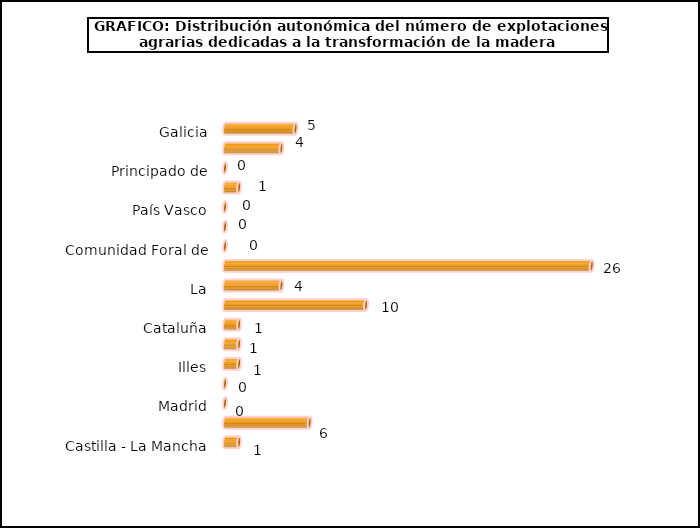
| Category | num. Explotaciones |
|---|---|
| 0 | 5 |
| 1 | 4 |
| 2 | 0 |
| 3 | 1 |
| 4 | 0 |
| 5 | 0 |
| 6 | 0 |
| 7 | 26 |
| 8 | 4 |
| 9 | 10 |
| 10 | 1 |
| 11 | 1 |
| 12 | 1 |
| 13 | 0 |
| 14 | 0 |
| 15 | 6 |
| 16 | 1 |